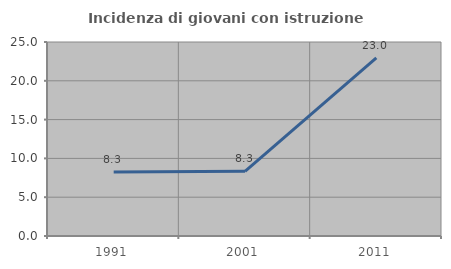
| Category | Incidenza di giovani con istruzione universitaria |
|---|---|
| 1991.0 | 8.259 |
| 2001.0 | 8.333 |
| 2011.0 | 22.951 |